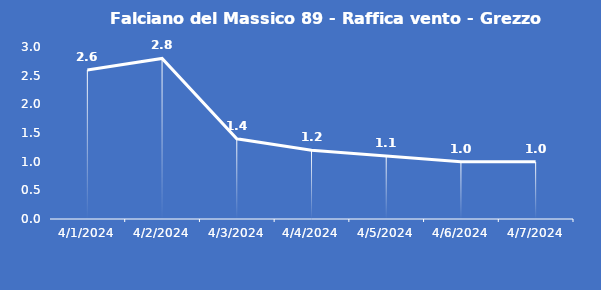
| Category | Falciano del Massico 89 - Raffica vento - Grezzo (m/s) |
|---|---|
| 4/1/24 | 2.6 |
| 4/2/24 | 2.8 |
| 4/3/24 | 1.4 |
| 4/4/24 | 1.2 |
| 4/5/24 | 1.1 |
| 4/6/24 | 1 |
| 4/7/24 | 1 |